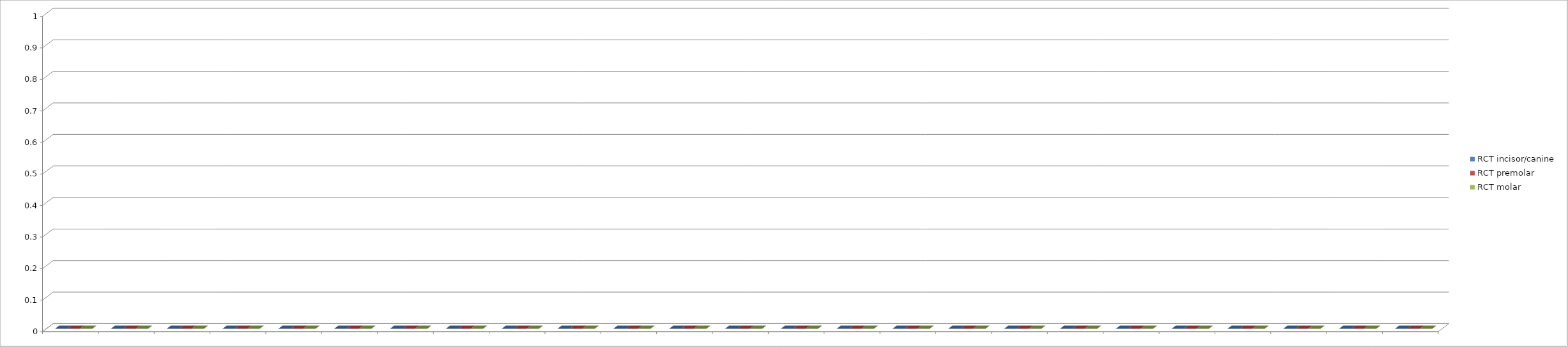
| Category | RCT incisor/canine | RCT premolar | RCT molar |
|---|---|---|---|
| 0 | 0 | 0 | 0 |
| 1 | 0 | 0 | 0 |
| 2 | 0 | 0 | 0 |
| 3 | 0 | 0 | 0 |
| 4 | 0 | 0 | 0 |
| 5 | 0 | 0 | 0 |
| 6 | 0 | 0 | 0 |
| 7 | 0 | 0 | 0 |
| 8 | 0 | 0 | 0 |
| 9 | 0 | 0 | 0 |
| 10 | 0 | 0 | 0 |
| 11 | 0 | 0 | 0 |
| 12 | 0 | 0 | 0 |
| 13 | 0 | 0 | 0 |
| 14 | 0 | 0 | 0 |
| 15 | 0 | 0 | 0 |
| 16 | 0 | 0 | 0 |
| 17 | 0 | 0 | 0 |
| 18 | 0 | 0 | 0 |
| 19 | 0 | 0 | 0 |
| 20 | 0 | 0 | 0 |
| 21 | 0 | 0 | 0 |
| 22 | 0 | 0 | 0 |
| 23 | 0 | 0 | 0 |
| 24 | 0 | 0 | 0 |